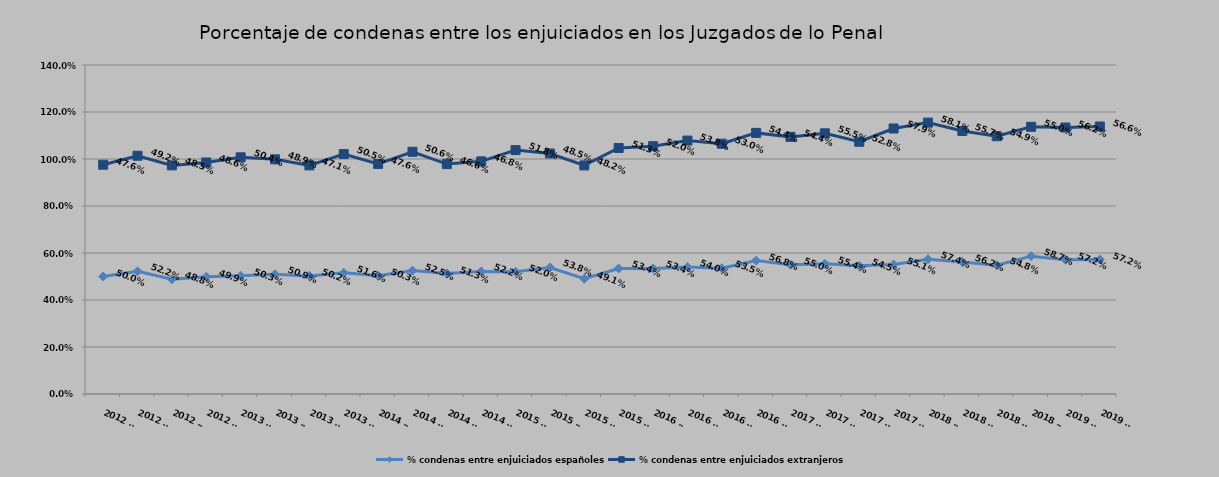
| Category | % condenas entre enjuiciados españoles | % condenas entre enjuiciados extranjeros |
|---|---|---|
| 2012 T1 | 0.5 | 0.476 |
| 2012 T2 | 0.522 | 0.492 |
| 2012 T3 | 0.488 | 0.485 |
| 2012 T4 | 0.499 | 0.486 |
| 2013 T1 | 0.503 | 0.504 |
| 2013 T2 | 0.509 | 0.489 |
| 2013 T3 | 0.502 | 0.471 |
| 2013 T4 | 0.516 | 0.505 |
| 2014 T1 | 0.503 | 0.476 |
| 2014 T2 | 0.525 | 0.506 |
| 2014 T3 | 0.513 | 0.466 |
| 2014 T4 | 0.522 | 0.468 |
| 2015 T1 | 0.52 | 0.518 |
| 2015 T2 | 0.538 | 0.485 |
| 2015 T3 | 0.491 | 0.482 |
| 2015 T4 | 0.534 | 0.513 |
| 2016 T1 | 0.534 | 0.52 |
| 2016 T2 | 0.54 | 0.538 |
| 2016 T3 | 0.535 | 0.53 |
| 2016 T4 | 0.568 | 0.544 |
| 2017 T1 | 0.55 | 0.544 |
| 2017 T2 | 0.554 | 0.555 |
| 2017 T3 | 0.545 | 0.528 |
| 2017 T4 | 0.551 | 0.579 |
| 2018 T1 | 0.574 | 0.581 |
| 2018 T2 | 0.562 | 0.557 |
| 2018 T3 | 0.548 | 0.549 |
| 2018 T4 | 0.587 | 0.55 |
| 2019 T1 | 0.572 | 0.562 |
| 2019 T2 | 0.572 | 0.566 |